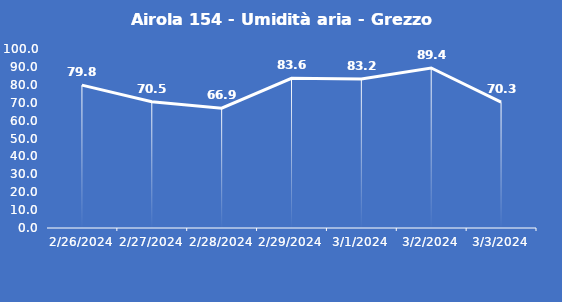
| Category | Airola 154 - Umidità aria - Grezzo (%) |
|---|---|
| 2/26/24 | 79.8 |
| 2/27/24 | 70.5 |
| 2/28/24 | 66.9 |
| 2/29/24 | 83.6 |
| 3/1/24 | 83.2 |
| 3/2/24 | 89.4 |
| 3/3/24 | 70.3 |